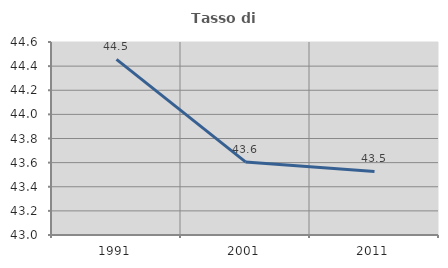
| Category | Tasso di occupazione   |
|---|---|
| 1991.0 | 44.456 |
| 2001.0 | 43.606 |
| 2011.0 | 43.526 |